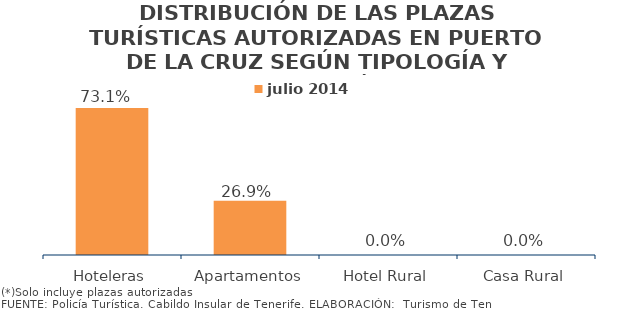
| Category | julio 2014 |
|---|---|
| Hoteleras | 0.731 |
| Apartamentos | 0.269 |
| Hotel Rural | 0 |
| Casa Rural | 0 |